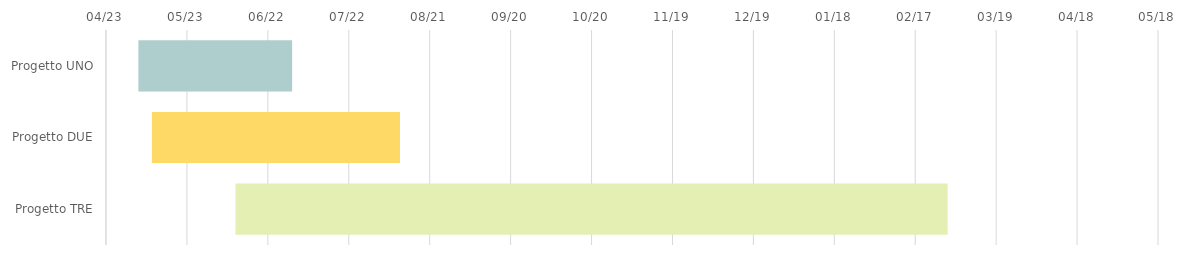
| Category | INIZIO | Durata |
|---|---|---|
| Progetto UNO | 2025-05-05 | 57 |
| Progetto DUE | 2025-05-10 | 92 |
| Progetto TRE | 2025-06-10 | 264 |